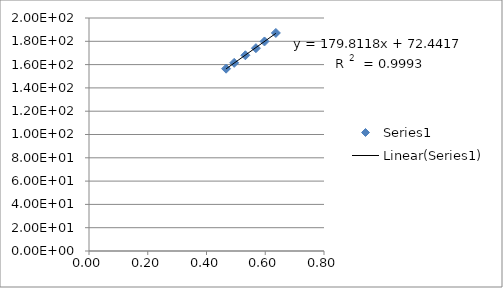
| Category | Series 0 |
|---|---|
| 0.46668 | 156.496 |
| 0.49426 | 161.507 |
| 0.53234 | 168.005 |
| 0.5682 | 174.104 |
| 0.59742 | 179.863 |
| 0.6361 | 187.155 |